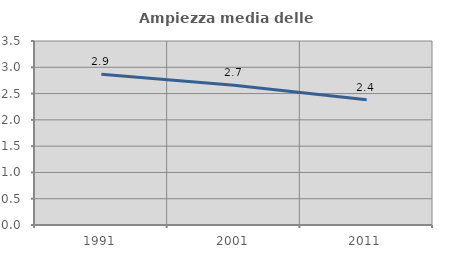
| Category | Ampiezza media delle famiglie |
|---|---|
| 1991.0 | 2.866 |
| 2001.0 | 2.659 |
| 2011.0 | 2.381 |